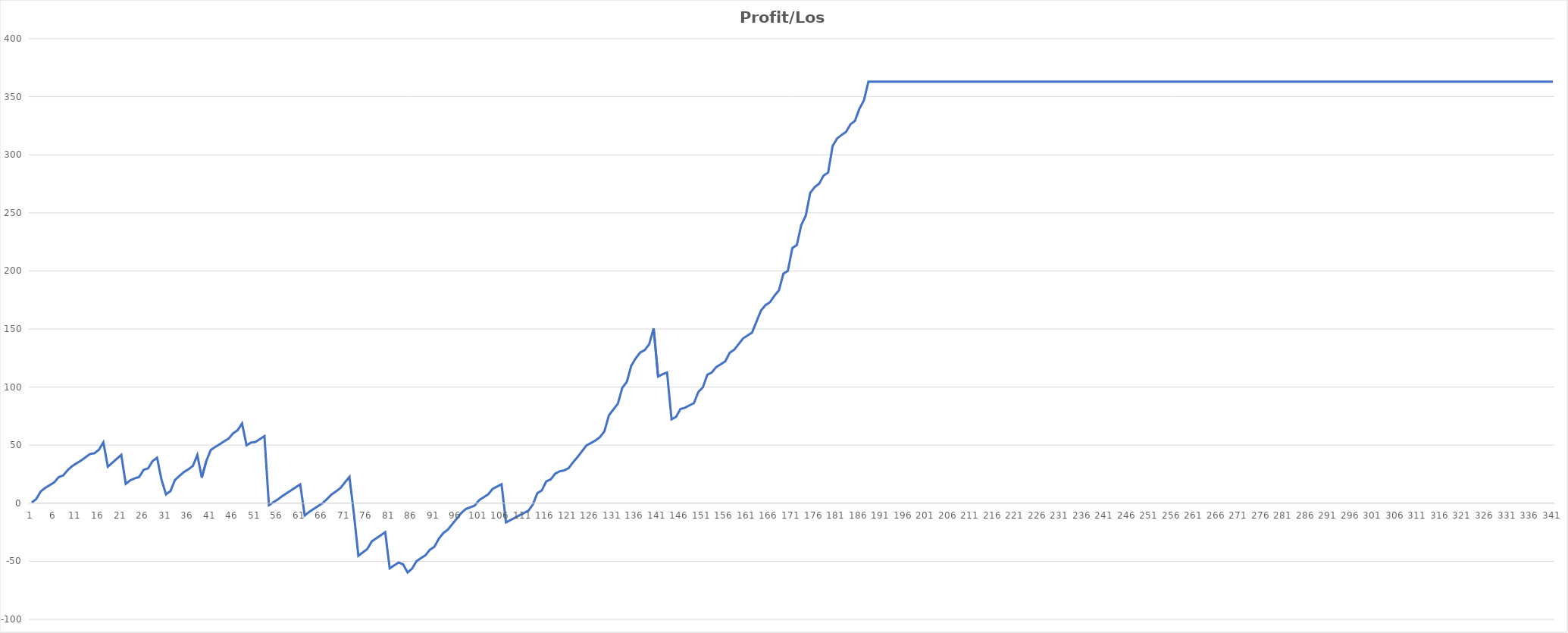
| Category | Profit/Loss |
|---|---|
| 0 | 0.57 |
| 1/1/00 | 3.64 |
| 1/2/00 | 10.14 |
| 1/3/00 | 13.18 |
| 1/4/00 | 15.55 |
| 1/5/00 | 17.92 |
| 1/6/00 | 22.42 |
| 1/7/00 | 23.87 |
| 1/8/00 | 28.37 |
| 1/9/00 | 31.88 |
| 1/10/00 | 34.38 |
| 1/11/00 | 36.75 |
| 1/12/00 | 39.5 |
| 1/13/00 | 42.35 |
| 1/14/00 | 43 |
| 1/15/00 | 46.02 |
| 1/16/00 | 52.42 |
| 1/17/00 | 31.42 |
| 1/18/00 | 34.84 |
| 1/19/00 | 38.26 |
| 1/20/00 | 41.68 |
| 1/21/00 | 16.67 |
| 1/22/00 | 19.69 |
| 1/23/00 | 21.4 |
| 1/24/00 | 22.59 |
| 1/25/00 | 28.76 |
| 1/26/00 | 29.99 |
| 1/27/00 | 36.29 |
| 1/28/00 | 39.14 |
| 1/29/00 | 20.11 |
| 1/30/00 | 7.61 |
| 1/31/00 | 10.46 |
| 2/1/00 | 19.96 |
| 2/2/00 | 23.52 |
| 2/3/00 | 26.84 |
| 2/4/00 | 29.21 |
| 2/5/00 | 32.06 |
| 2/6/00 | 41.56 |
| 2/7/00 | 21.99 |
| 2/8/00 | 36.24 |
| 2/9/00 | 45.81 |
| 2/10/00 | 48.41 |
| 2/11/00 | 50.78 |
| 2/12/00 | 53.3 |
| 2/13/00 | 55.67 |
| 2/14/00 | 60.17 |
| 2/15/00 | 62.77 |
| 2/16/00 | 68.69 |
| 2/17/00 | 49.87 |
| 2/18/00 | 52.24 |
| 2/19/00 | 52.76 |
| 2/20/00 | 55.24 |
| 2/21/00 | 57.76 |
| 2/22/00 | -1.74 |
| 2/23/00 | 0.78 |
| 2/24/00 | 3.3 |
| 2/25/00 | 6.15 |
| 2/26/00 | 8.67 |
| 2/27/00 | 11.19 |
| 2/28/00 | 13.71 |
| 2/28/00 | 16.23 |
| 3/1/00 | -10.61 |
| 3/2/00 | -7.48 |
| 3/3/00 | -4.96 |
| 3/4/00 | -2.44 |
| 3/5/00 | 0.08 |
| 3/6/00 | 3.6 |
| 3/7/00 | 7.5 |
| 3/8/00 | 10.19 |
| 3/9/00 | 13.13 |
| 3/10/00 | 17.89 |
| 3/11/00 | 22.69 |
| 3/12/00 | -9.05 |
| 3/13/00 | -45.27 |
| 3/14/00 | -42.33 |
| 3/15/00 | -39.39 |
| 3/16/00 | -32.82 |
| 3/17/00 | -30.22 |
| 3/18/00 | -27.62 |
| 3/19/00 | -24.93 |
| 3/20/00 | -56.05 |
| 3/21/00 | -53.55 |
| 3/22/00 | -51.05 |
| 3/23/00 | -52.65 |
| 3/24/00 | -59.65 |
| 3/25/00 | -56.32 |
| 3/26/00 | -49.9 |
| 3/27/00 | -47.25 |
| 3/28/00 | -44.75 |
| 3/29/00 | -39.99 |
| 3/30/00 | -37.49 |
| 3/31/00 | -30.43 |
| 4/1/00 | -25.67 |
| 4/2/00 | -22.73 |
| 4/3/00 | -17.97 |
| 4/4/00 | -13.21 |
| 4/5/00 | -8.45 |
| 4/6/00 | -5.02 |
| 4/7/00 | -3.52 |
| 4/8/00 | -2.02 |
| 4/9/00 | 2.68 |
| 4/10/00 | 5.13 |
| 4/11/00 | 7.58 |
| 4/12/00 | 12.34 |
| 4/13/00 | 14.34 |
| 4/14/00 | 16.34 |
| 4/15/00 | -16.49 |
| 4/16/00 | -14.52 |
| 4/17/00 | -12.52 |
| 4/18/00 | -10.44 |
| 4/19/00 | -8.44 |
| 4/20/00 | -6.44 |
| 4/21/00 | -1.15 |
| 4/22/00 | 8.65 |
| 4/23/00 | 11 |
| 4/24/00 | 18.78 |
| 4/25/00 | 20.54 |
| 4/26/00 | 25.48 |
| 4/27/00 | 27.48 |
| 4/28/00 | 28.26 |
| 4/29/00 | 30.26 |
| 4/30/00 | 35.29 |
| 5/1/00 | 39.83 |
| 5/2/00 | 44.83 |
| 5/3/00 | 49.83 |
| 5/4/00 | 51.83 |
| 5/5/00 | 54.06 |
| 5/6/00 | 56.94 |
| 5/7/00 | 61.94 |
| 5/8/00 | 75.7 |
| 5/9/00 | 80.7 |
| 5/10/00 | 85.7 |
| 5/11/00 | 99.46 |
| 5/12/00 | 104.46 |
| 5/13/00 | 118.42 |
| 5/14/00 | 124.83 |
| 5/15/00 | 129.83 |
| 5/16/00 | 131.83 |
| 5/17/00 | 136.83 |
| 5/18/00 | 150.59 |
| 5/19/00 | 109.11 |
| 5/20/00 | 111.11 |
| 5/21/00 | 112.61 |
| 5/22/00 | 72.3 |
| 5/23/00 | 74.3 |
| 5/24/00 | 81.14 |
| 5/25/00 | 82.22 |
| 5/26/00 | 84.22 |
| 5/27/00 | 86.22 |
| 5/28/00 | 95.82 |
| 5/29/00 | 99.78 |
| 5/30/00 | 110.6 |
| 5/31/00 | 112.6 |
| 6/1/00 | 117.3 |
| 6/2/00 | 119.63 |
| 6/3/00 | 122.13 |
| 6/4/00 | 129.62 |
| 6/5/00 | 132.12 |
| 6/6/00 | 137.07 |
| 6/7/00 | 141.97 |
| 6/8/00 | 144.47 |
| 6/9/00 | 146.97 |
| 6/10/00 | 156.47 |
| 6/11/00 | 165.97 |
| 6/12/00 | 170.57 |
| 6/13/00 | 173.07 |
| 6/14/00 | 178.65 |
| 6/15/00 | 183.25 |
| 6/16/00 | 197.61 |
| 6/17/00 | 200.11 |
| 6/18/00 | 219.76 |
| 6/19/00 | 222.26 |
| 6/20/00 | 239.6 |
| 6/21/00 | 247.63 |
| 6/22/00 | 267.28 |
| 6/23/00 | 272.18 |
| 6/24/00 | 275.18 |
| 6/25/00 | 282.17 |
| 6/26/00 | 284.67 |
| 6/27/00 | 307.54 |
| 6/28/00 | 314.04 |
| 6/29/00 | 317.04 |
| 6/30/00 | 319.78 |
| 7/1/00 | 326.28 |
| 7/2/00 | 329.28 |
| 7/3/00 | 339.69 |
| 7/4/00 | 346.77 |
| 7/5/00 | 363 |
| 7/6/00 | 363 |
| 7/7/00 | 363 |
| 7/8/00 | 363 |
| 7/9/00 | 363 |
| 7/10/00 | 363 |
| 7/11/00 | 363 |
| 7/12/00 | 363 |
| 7/13/00 | 363 |
| 7/14/00 | 363 |
| 7/15/00 | 363 |
| 7/16/00 | 363 |
| 7/17/00 | 363 |
| 7/18/00 | 363 |
| 7/19/00 | 363 |
| 7/20/00 | 363 |
| 7/21/00 | 363 |
| 7/22/00 | 363 |
| 7/23/00 | 363 |
| 7/24/00 | 363 |
| 7/25/00 | 363 |
| 7/26/00 | 363 |
| 7/27/00 | 363 |
| 7/28/00 | 363 |
| 7/29/00 | 363 |
| 7/30/00 | 363 |
| 7/31/00 | 363 |
| 8/1/00 | 363 |
| 8/2/00 | 363 |
| 8/3/00 | 363 |
| 8/4/00 | 363 |
| 8/5/00 | 363 |
| 8/6/00 | 363 |
| 8/7/00 | 363 |
| 8/8/00 | 363 |
| 8/9/00 | 363 |
| 8/10/00 | 363 |
| 8/11/00 | 363 |
| 8/12/00 | 363 |
| 8/13/00 | 363 |
| 8/14/00 | 363 |
| 8/15/00 | 363 |
| 8/16/00 | 363 |
| 8/17/00 | 363 |
| 8/18/00 | 363 |
| 8/19/00 | 363 |
| 8/20/00 | 363 |
| 8/21/00 | 363 |
| 8/22/00 | 363 |
| 8/23/00 | 363 |
| 8/24/00 | 363 |
| 8/25/00 | 363 |
| 8/26/00 | 363 |
| 8/27/00 | 363 |
| 8/28/00 | 363 |
| 8/29/00 | 363 |
| 8/30/00 | 363 |
| 8/31/00 | 363 |
| 9/1/00 | 363 |
| 9/2/00 | 363 |
| 9/3/00 | 363 |
| 9/4/00 | 363 |
| 9/5/00 | 363 |
| 9/6/00 | 363 |
| 9/7/00 | 363 |
| 9/8/00 | 363 |
| 9/9/00 | 363 |
| 9/10/00 | 363 |
| 9/11/00 | 363 |
| 9/12/00 | 363 |
| 9/13/00 | 363 |
| 9/14/00 | 363 |
| 9/15/00 | 363 |
| 9/16/00 | 363 |
| 9/17/00 | 363 |
| 9/18/00 | 363 |
| 9/19/00 | 363 |
| 9/20/00 | 363 |
| 9/21/00 | 363 |
| 9/22/00 | 363 |
| 9/23/00 | 363 |
| 9/24/00 | 363 |
| 9/25/00 | 363 |
| 9/26/00 | 363 |
| 9/27/00 | 363 |
| 9/28/00 | 363 |
| 9/29/00 | 363 |
| 9/30/00 | 363 |
| 10/1/00 | 363 |
| 10/2/00 | 363 |
| 10/3/00 | 363 |
| 10/4/00 | 363 |
| 10/5/00 | 363 |
| 10/6/00 | 363 |
| 10/7/00 | 363 |
| 10/8/00 | 363 |
| 10/9/00 | 363 |
| 10/10/00 | 363 |
| 10/11/00 | 363 |
| 10/12/00 | 363 |
| 10/13/00 | 363 |
| 10/14/00 | 363 |
| 10/15/00 | 363 |
| 10/16/00 | 363 |
| 10/17/00 | 363 |
| 10/18/00 | 363 |
| 10/19/00 | 363 |
| 10/20/00 | 363 |
| 10/21/00 | 363 |
| 10/22/00 | 363 |
| 10/23/00 | 363 |
| 10/24/00 | 363 |
| 10/25/00 | 363 |
| 10/26/00 | 363 |
| 10/27/00 | 363 |
| 10/28/00 | 363 |
| 10/29/00 | 363 |
| 10/30/00 | 363 |
| 10/31/00 | 363 |
| 11/1/00 | 363 |
| 11/2/00 | 363 |
| 11/3/00 | 363 |
| 11/4/00 | 363 |
| 11/5/00 | 363 |
| 11/6/00 | 363 |
| 11/7/00 | 363 |
| 11/8/00 | 363 |
| 11/9/00 | 363 |
| 11/10/00 | 363 |
| 11/11/00 | 363 |
| 11/12/00 | 363 |
| 11/13/00 | 363 |
| 11/14/00 | 363 |
| 11/15/00 | 363 |
| 11/16/00 | 363 |
| 11/17/00 | 363 |
| 11/18/00 | 363 |
| 11/19/00 | 363 |
| 11/20/00 | 363 |
| 11/21/00 | 363 |
| 11/22/00 | 363 |
| 11/23/00 | 363 |
| 11/24/00 | 363 |
| 11/25/00 | 363 |
| 11/26/00 | 363 |
| 11/27/00 | 363 |
| 11/28/00 | 363 |
| 11/29/00 | 363 |
| 11/30/00 | 363 |
| 12/1/00 | 363 |
| 12/2/00 | 363 |
| 12/3/00 | 363 |
| 12/4/00 | 363 |
| 12/5/00 | 363 |